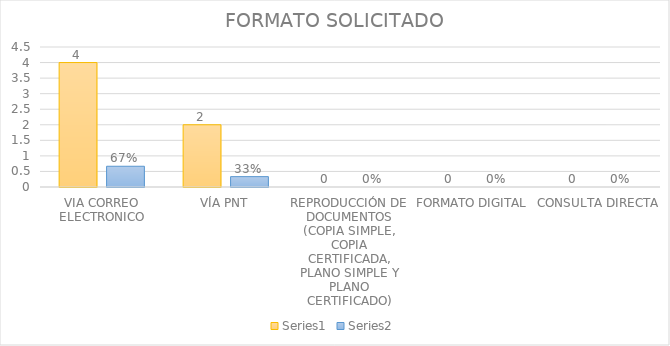
| Category | Series 3 | Series 4 |
|---|---|---|
| VIA CORREO ELECTRONICO | 4 | 0.667 |
| VÍA PNT | 2 | 0.333 |
| REPRODUCCIÓN DE DOCUMENTOS (COPIA SIMPLE, COPIA CERTIFICADA, PLANO SIMPLE Y PLANO CERTIFICADO) | 0 | 0 |
| FORMATO DIGITAL | 0 | 0 |
| CONSULTA DIRECTA | 0 | 0 |